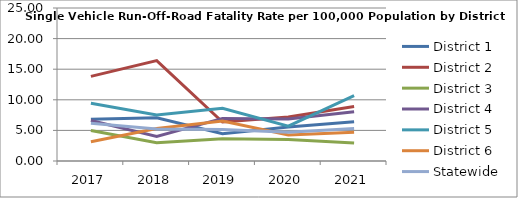
| Category | District 1 | District 2 | District 3 | District 4 | District 5 | District 6 | Statewide |
|---|---|---|---|---|---|---|---|
| 2017.0 | 6.813 | 13.822 | 4.969 | 6.609 | 9.42 | 3.151 | 6.174 |
| 2018.0 | 7.077 | 16.412 | 2.975 | 4.019 | 7.538 | 5.307 | 5.245 |
| 2019.0 | 4.474 | 6.377 | 3.63 | 6.964 | 8.621 | 6.526 | 5.148 |
| 2020.0 | 5.546 | 7.201 | 3.533 | 6.862 | 5.693 | 4.263 | 4.707 |
| 2021.0 | 6.406 | 8.895 | 2.961 | 8.058 | 10.673 | 4.689 | 5.313 |